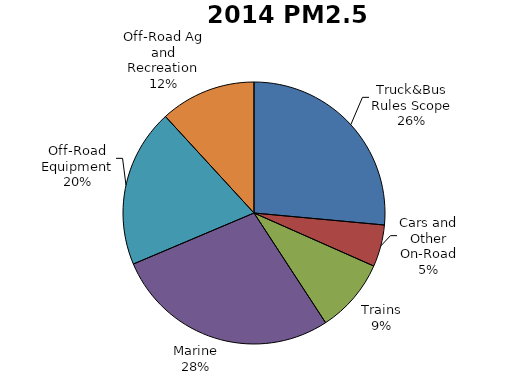
| Category | Series 0 |
|---|---|
| Truck&Bus Rules Scope | 8.341 |
| Cars and Other On-Road | 1.63 |
| Trains | 2.888 |
| Marine | 8.773 |
| Off-Road Equipment | 6.162 |
| Off-Road Ag and Recreation | 3.725 |